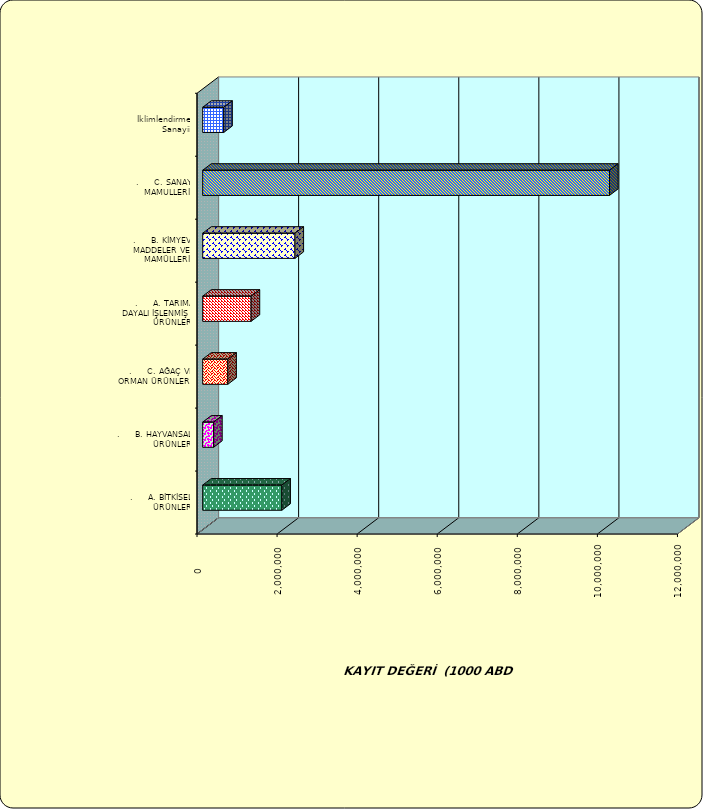
| Category | Series 0 |
|---|---|
| .     A. BİTKİSEL ÜRÜNLER | 1976634.199 |
| .     B. HAYVANSAL ÜRÜNLER | 272220.711 |
| .     C. AĞAÇ VE ORMAN ÜRÜNLERİ | 626715.738 |
| .     A. TARIMA DAYALI İŞLENMİŞ ÜRÜNLER | 1209197.918 |
| .     B. KİMYEVİ MADDELER VE MAMÜLLERİ | 2304656.614 |
| .     C. SANAYİ MAMULLERİ | 10160518.172 |
|  İklimlendirme Sanayii | 525475.298 |